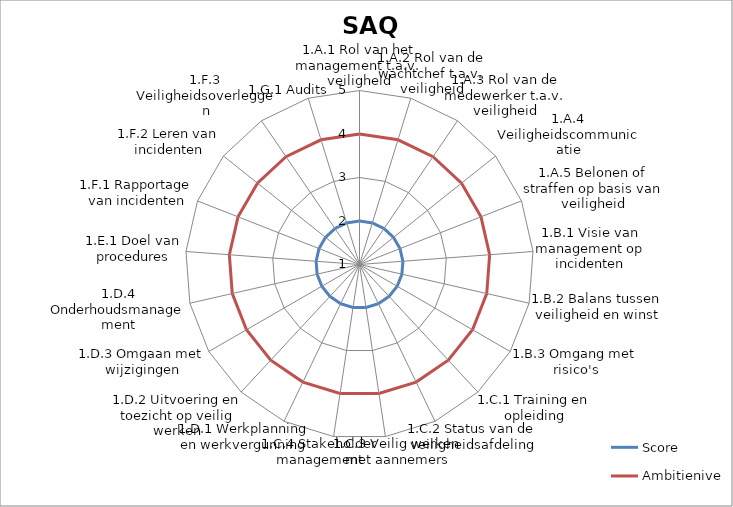
| Category | Score | Ambitieniveau |
|---|---|---|
| 1.A.1 Rol van het management t.a.v. veiligheid | 0 | 4 |
| 1.A.2 Rol van de wachtchef t.a.v. veiligheid | 0 | 4 |
| 1.A.3 Rol van de medewerker t.a.v. veiligheid | 0 | 4 |
| 1.A.4 Veiligheidscommunicatie | 0 | 4 |
| 1.A.5 Belonen of straffen op basis van veiligheid | 0 | 4 |
| 1.B.1 Visie van management op incidenten | 0 | 4 |
| 1.B.2 Balans tussen veiligheid en winst | 0 | 4 |
| 1.B.3 Omgang met risico's | 0 | 4 |
| 1.C.1 Training en opleiding | 0 | 4 |
| 1.C.2 Status van de veiligheidsafdeling | 0 | 4 |
| 1.C.3 Veilig werken met aannemers | 0 | 4 |
| 1.C.4 Stakeholder management | 0 | 4 |
| 1.D.1 Werkplanning en werkvergunning | 0 | 4 |
| 1.D.2 Uitvoering en toezicht op veilig werken | 0 | 4 |
| 1.D.3 Omgaan met wijzigingen | 0 | 4 |
| 1.D.4 Onderhoudsmanagement | 0 | 4 |
| 1.E.1 Doel van procedures | 0 | 4 |
| 1.F.1 Rapportage van incidenten | 0 | 4 |
| 1.F.2 Leren van incidenten | 0 | 4 |
| 1.F.3 Veiligheidsoverleggen | 0 | 4 |
| 1.G.1 Audits | 0 | 4 |